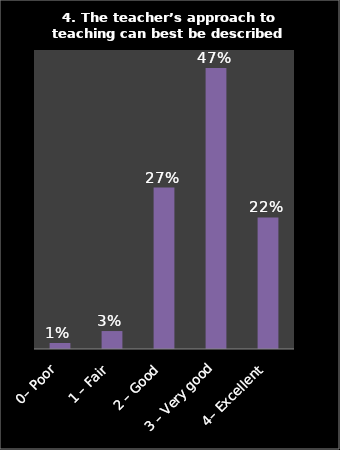
| Category | Series 0 |
|---|---|
| 0– Poor | 0.01 |
| 1 – Fair | 0.03 |
| 2 – Good | 0.27 |
| 3 – Very good | 0.47 |
| 4– Excellent | 0.22 |